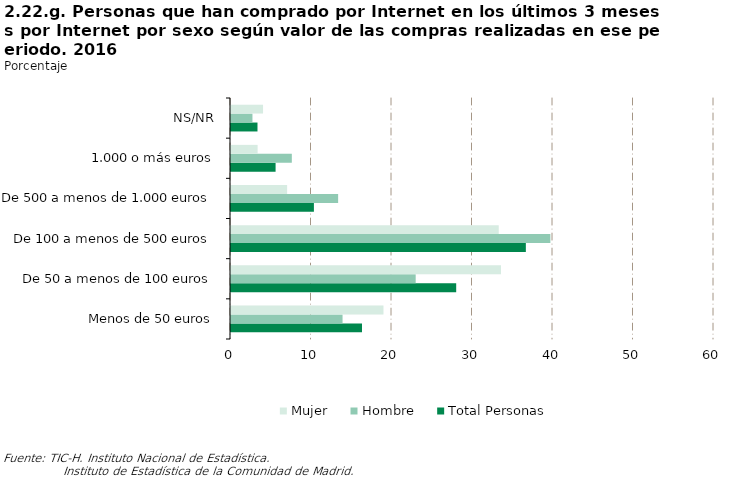
| Category | Total Personas | Hombre | Mujer |
|---|---|---|---|
| Menos de 50 euros | 16.273 | 13.858 | 18.944 |
| De 50 a menos de 100 euros | 27.974 | 22.942 | 33.541 |
| De 100 a menos de 500 euros | 36.626 | 39.673 | 33.256 |
| De 500 a menos de 1.000 euros | 10.299 | 13.308 | 6.97 |
| 1.000 o más euros | 5.538 | 7.555 | 3.307 |
| NS/NR | 3.29 | 2.665 | 3.982 |